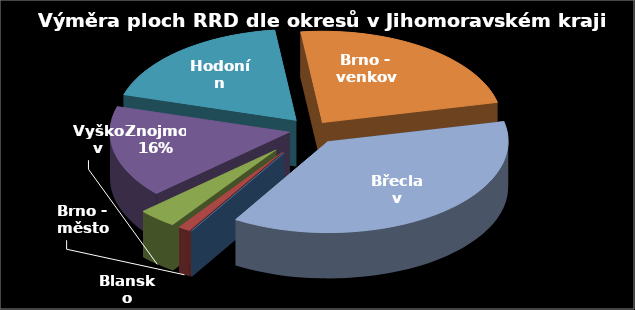
| Category | Výměra [ha] |
|---|---|
| Blansko | 0 |
| Brno - město | 2.27 |
| Vyškov | 7.23 |
| Znojmo | 33.27 |
| Hodonín | 37.9 |
| Brno - venkov | 47.74 |
| Břeclav | 75.94 |